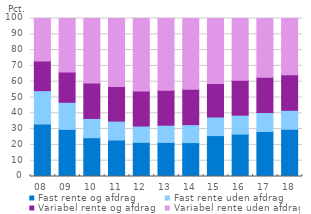
| Category | Fast rente og afdrag | Fast rente uden afdrag | Variabel rente og afdrag | Variabel rente uden afdrag |
|---|---|---|---|---|
| 08 | 33.218 | 21.109 | 18.783 | 26.89 |
| 09 | 29.814 | 17.153 | 19.142 | 33.892 |
| 10 | 24.547 | 12.194 | 22.371 | 40.888 |
| 11 | 23.078 | 11.956 | 21.931 | 43.035 |
| 12 | 21.606 | 10.326 | 22.123 | 45.944 |
| 13 | 21.564 | 10.897 | 22.093 | 45.445 |
| 14 | 21.454 | 11.381 | 22.42 | 44.745 |
| 15 | 25.903 | 11.775 | 21.202 | 41.12 |
| 16 | 26.83 | 11.964 | 22.121 | 39.085 |
| 17 | 28.495 | 11.966 | 22.299 | 37.239 |
| 18 | 29.888 | 11.999 | 22.572 | 35.54 |